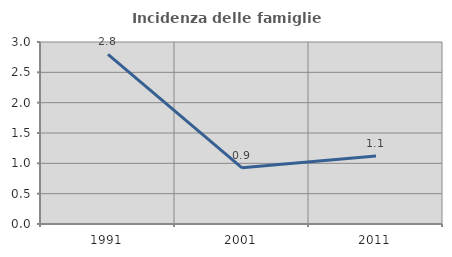
| Category | Incidenza delle famiglie numerose |
|---|---|
| 1991.0 | 2.795 |
| 2001.0 | 0.926 |
| 2011.0 | 1.121 |